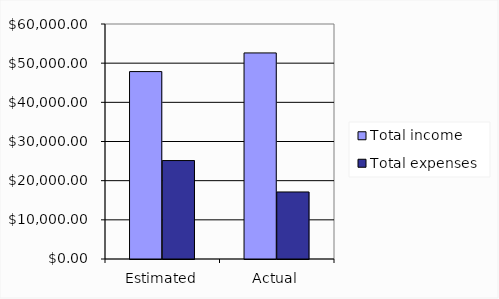
| Category | Total income | Total expenses |
|---|---|---|
| Estimated | 47850 | 25133 |
| Actual | 52615 | 17116 |